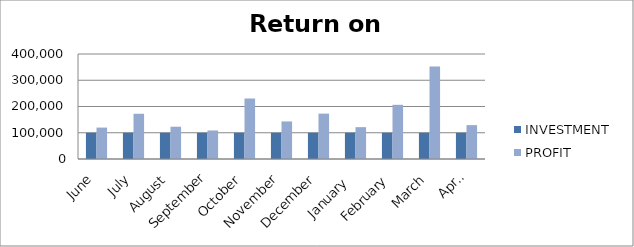
| Category | INVESTMENT  | PROFIT |
|---|---|---|
| June | 100000 | 119705 |
| July | 100000 | 172291 |
| August | 100000 | 122944 |
| September | 100000 | 108627 |
| October | 100000 | 230487 |
| November | 100000 | 143076 |
| December | 100000 | 172860 |
| January  | 100000 | 121311 |
| February | 100000 | 206400 |
| March | 100000 | 352700 |
| April | 100000 | 129000 |